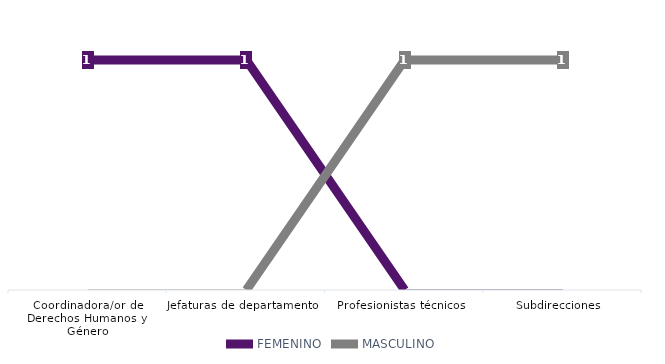
| Category | FEMENINO | MASCULINO |
|---|---|---|
| Coordinadora/or de Derechos Humanos y Género | 1 | 0 |
| Jefaturas de departamento | 1 | 0 |
| Profesionistas técnicos | 0 | 1 |
| Subdirecciones | 0 | 1 |